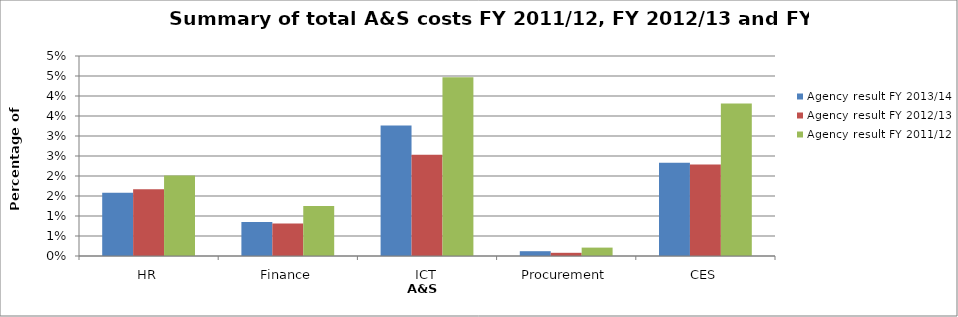
| Category | Agency result FY 2013/14 | Agency result FY 2012/13 | Agency result FY 2011/12 |
|---|---|---|---|
| HR | 0.016 | 0.017 | 0.02 |
| Finance | 0.008 | 0.008 | 0.012 |
| ICT | 0.033 | 0.025 | 0.045 |
| Procurement | 0.001 | 0.001 | 0.002 |
| CES | 0.023 | 0.023 | 0.038 |